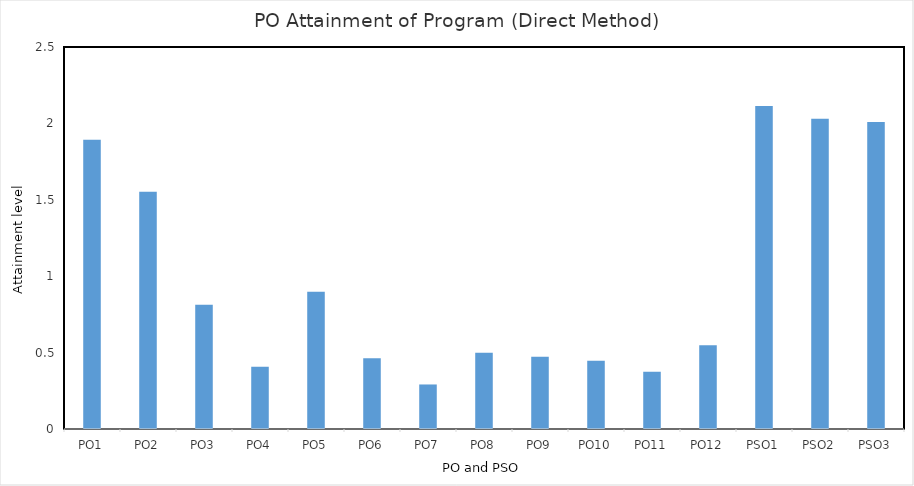
| Category | PO1 |
|---|---|
| PO1 | 1.894 |
| PO2 | 1.553 |
| PO3 | 0.813 |
| PO4 | 0.408 |
| PO5 | 0.899 |
| PO6 | 0.463 |
| PO7 | 0.291 |
| PO8 | 0.499 |
| PO9 | 0.473 |
| PO10 | 0.447 |
| PO11 | 0.375 |
| PO12 | 0.548 |
| PSO1 | 2.114 |
| PSO2 | 2.03 |
| PSO3 | 2.009 |